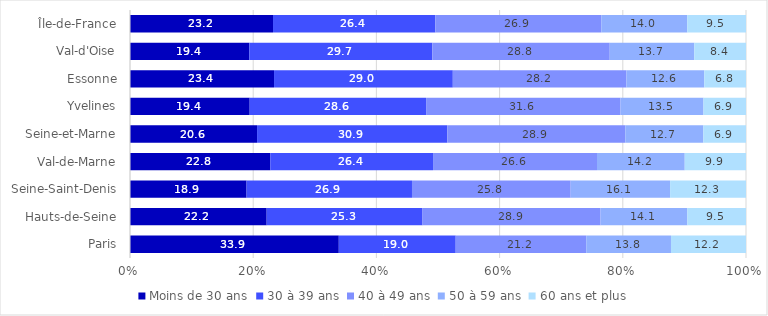
| Category | Moins de 30 ans | 30 à 39 ans | 40 à 49 ans | 50 à 59 ans | 60 ans et plus |
|---|---|---|---|---|---|
| Paris | 33.896 | 18.98 | 21.194 | 13.752 | 12.178 |
| Hauts-de-Seine | 22.188 | 25.302 | 28.896 | 14.099 | 9.514 |
| Seine-Saint-Denis | 18.924 | 26.854 | 25.759 | 16.144 | 12.319 |
| Val-de-Marne | 22.77 | 26.424 | 26.618 | 14.241 | 9.947 |
| Seine-et-Marne | 20.626 | 30.886 | 28.898 | 12.662 | 6.928 |
| Yvelines | 19.43 | 28.641 | 31.56 | 13.466 | 6.903 |
| Essonne | 23.382 | 29.023 | 28.182 | 12.64 | 6.772 |
| Val-d'Oise | 19.367 | 29.709 | 28.806 | 13.722 | 8.397 |
| Île-de-France | 23.217 | 26.355 | 26.935 | 13.962 | 9.53 |